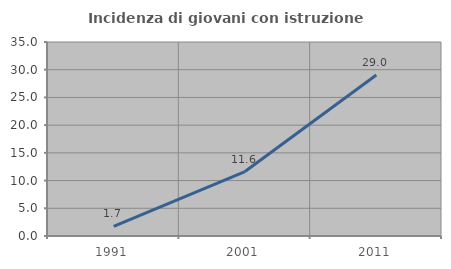
| Category | Incidenza di giovani con istruzione universitaria |
|---|---|
| 1991.0 | 1.724 |
| 2001.0 | 11.628 |
| 2011.0 | 29.032 |